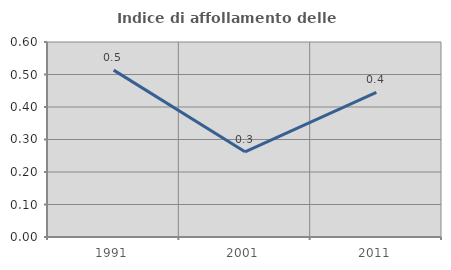
| Category | Indice di affollamento delle abitazioni  |
|---|---|
| 1991.0 | 0.513 |
| 2001.0 | 0.262 |
| 2011.0 | 0.445 |